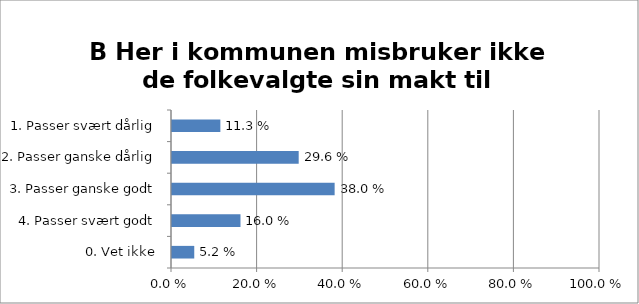
| Category |  
B Her i kommunen misbruker ikke de folkevalgte sin makt til personlig fordel  |
|---|---|
| 1. Passer svært dårlig | 0.113 |
| 2. Passer ganske dårlig | 0.296 |
| 3. Passer ganske godt | 0.38 |
| 4. Passer svært godt | 0.16 |
| 0. Vet ikke | 0.052 |